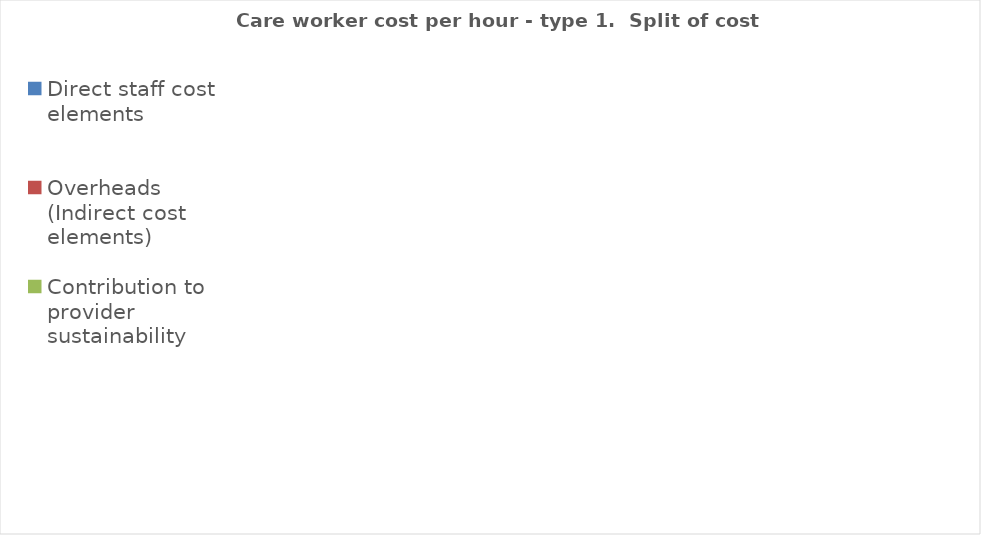
| Category | Series 0 |
|---|---|
| Direct staff cost elements | 0 |
| Overheads (Indirect cost elements) | 0 |
| Contribution to provider sustainability | 0 |